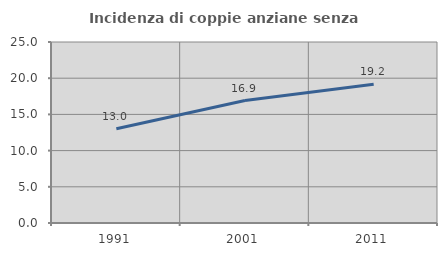
| Category | Incidenza di coppie anziane senza figli  |
|---|---|
| 1991.0 | 13.016 |
| 2001.0 | 16.913 |
| 2011.0 | 19.176 |